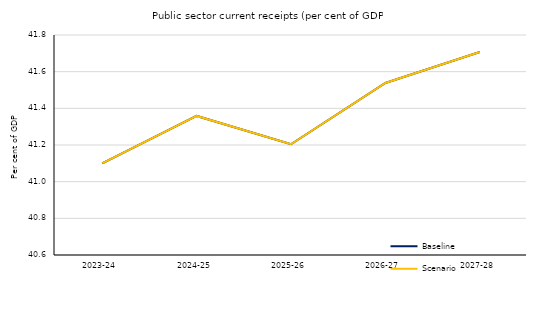
| Category | Baseline | Scenario |
|---|---|---|
| 2023-24 | 41.1 | 41.1 |
| 2024-25 | 41.359 | 41.359 |
| 2025-26 | 41.204 | 41.204 |
| 2026-27 | 41.538 | 41.538 |
| 2027-28 | 41.707 | 41.707 |